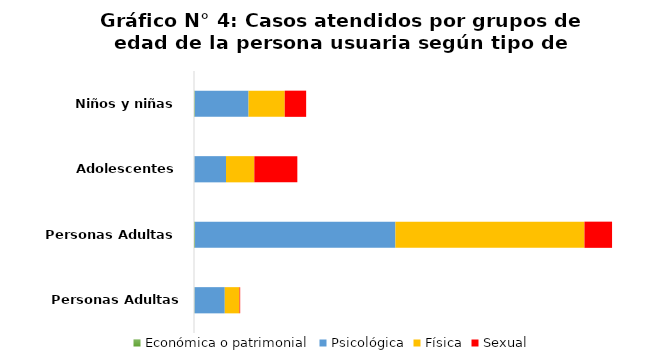
| Category | Económica o patrimonial | Psicológica | Física | Sexual |
|---|---|---|---|---|
| Niños y niñas | 193 | 11904 | 8024 | 4747 |
| Adolescentes | 69 | 7024 | 6283 | 9537 |
| Personas Adultas | 227 | 44433 | 41918 | 6118 |
| Personas Adultas Mayores | 109 | 6715 | 3273 | 141 |